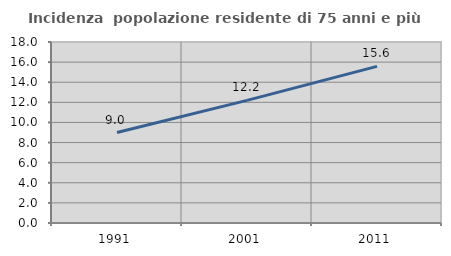
| Category | Incidenza  popolazione residente di 75 anni e più |
|---|---|
| 1991.0 | 8.998 |
| 2001.0 | 12.197 |
| 2011.0 | 15.575 |